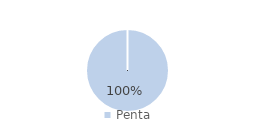
| Category | Series 0 |
|---|---|
| Penta | 0.588 |